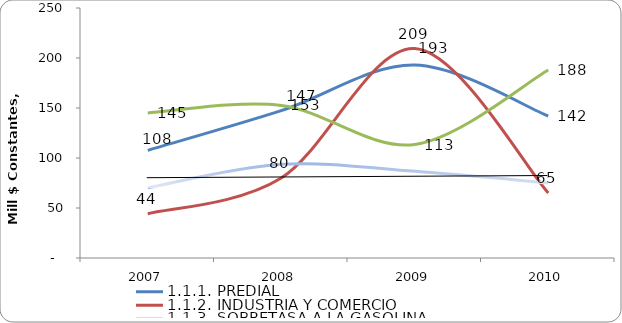
| Category | 1.1.1. PREDIAL | 1.1.2. INDUSTRIA Y COMERCIO | 1.1.3. SOBRETASA A LA GASOLINA | 1.1.4. OTROS |
|---|---|---|---|---|
| 2007 | 107.64 | 44.189 | 70.249 | 145.03 |
| 2008 | 147.327 | 79.977 | 93.658 | 152.588 |
| 2009 | 192.928 | 209.435 | 86.663 | 113.487 |
| 2010 | 142 | 65 | 75 | 188 |